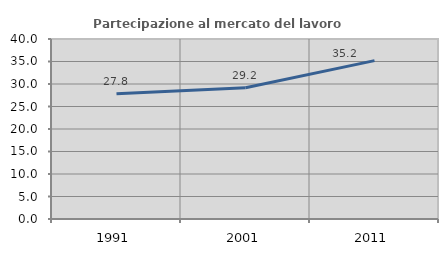
| Category | Partecipazione al mercato del lavoro  femminile |
|---|---|
| 1991.0 | 27.826 |
| 2001.0 | 29.155 |
| 2011.0 | 35.188 |